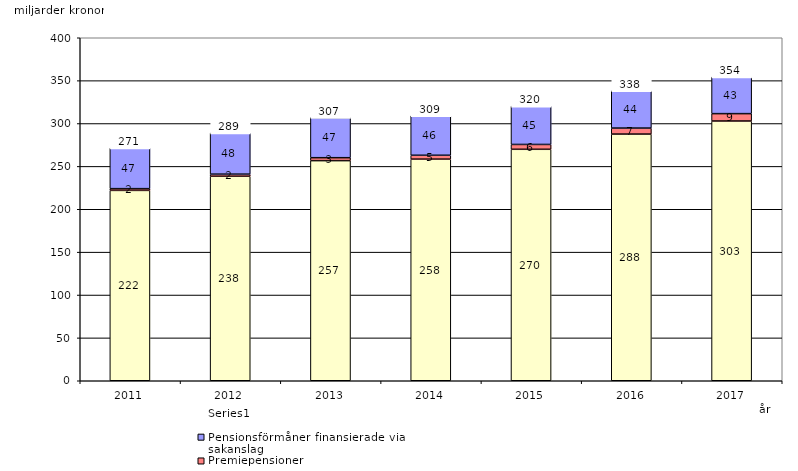
| Category | Inkomstpension och tilläggspension m.m. | Premiepensioner | Pensionsförmåner finansierade via sakanslag | Series 0 |
|---|---|---|---|---|
| 2011.0 | 222.004 | 2.022 | 47.319 | 20 |
| 2012.0 | 238.478 | 2.465 | 48.024 | 20 |
| 2013.0 | 256.699 | 3.416 | 46.794 | 20 |
| 2014.0 | 258.454 | 4.502 | 46.141 | 20 |
| 2015.0 | 269.917 | 5.652 | 44.679 | 20 |
| 2016.0 | 287.665 | 7 | 43.537 | 20 |
| 2017.0 | 302.911 | 8.587 | 42.71 | 20 |